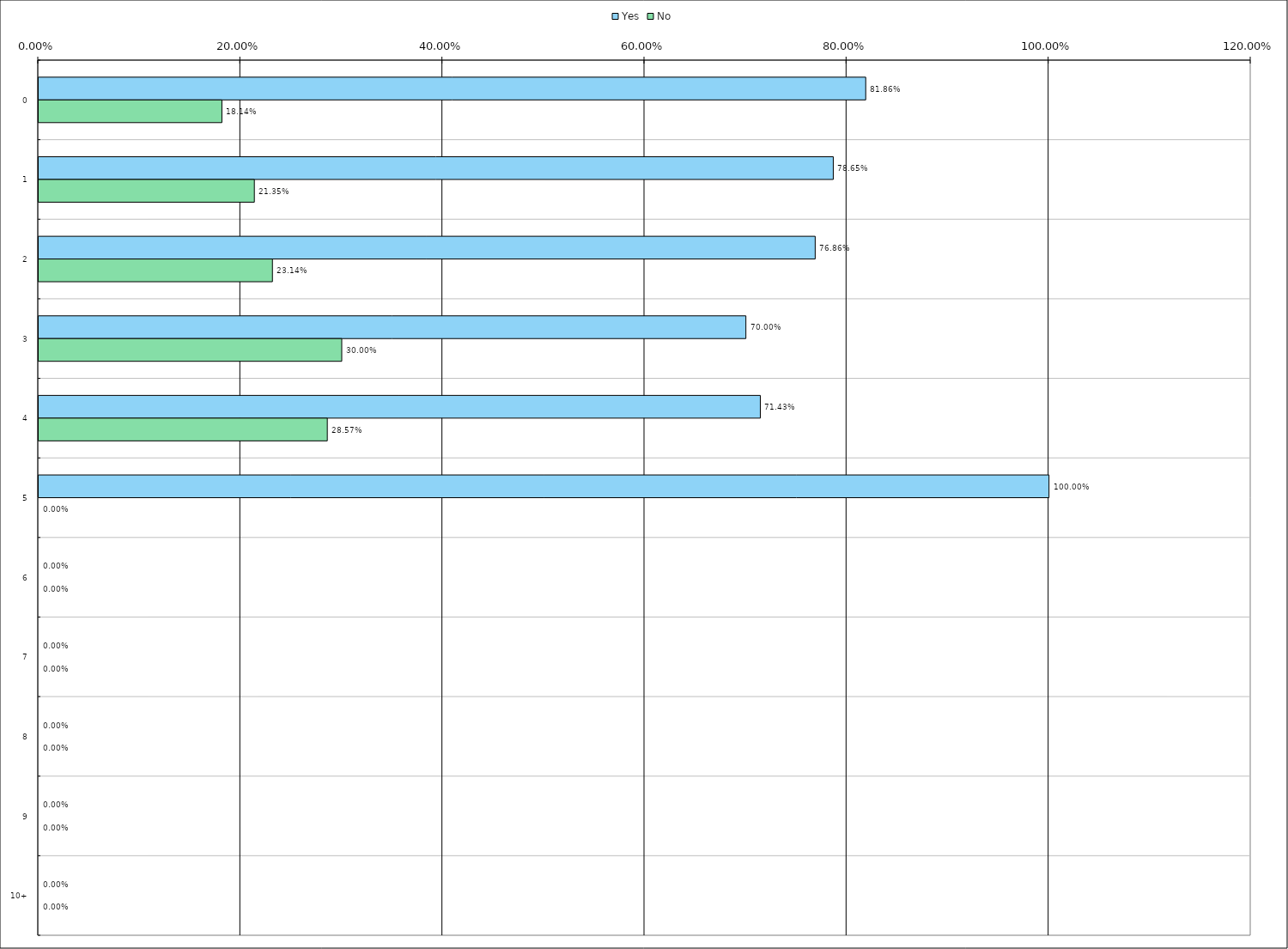
| Category | Yes | No |
|---|---|---|
| 0 | 0.819 | 0.181 |
| 1 | 0.786 | 0.214 |
| 2 | 0.769 | 0.231 |
| 3 | 0.7 | 0.3 |
| 4 | 0.714 | 0.286 |
| 5 | 1 | 0 |
| 6 | 0 | 0 |
| 7 | 0 | 0 |
| 8 | 0 | 0 |
| 9 | 0 | 0 |
| 10 | 0 | 0 |